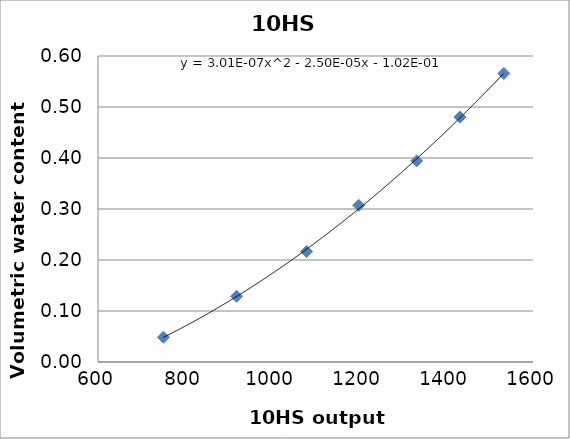
| Category | Series 0 |
|---|---|
| 750.5 | 0.049 |
| 918.5 | 0.129 |
| 1079.5 | 0.216 |
| 1199.5 | 0.307 |
| 1332.5 | 0.394 |
| 1432.0 | 0.48 |
| 1533.0 | 0.566 |